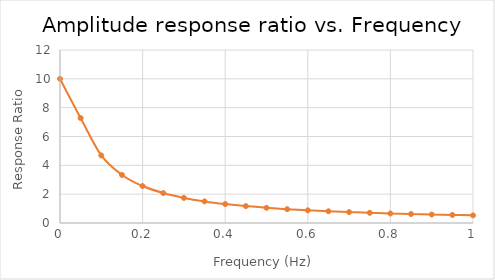
| Category | Series 1 |
|---|---|
| 0.0 | 10 |
| 0.05 | 7.277 |
| 0.1 | 4.686 |
| 0.15 | 3.334 |
| 0.2 | 2.564 |
| 0.25 | 2.076 |
| 0.3 | 1.741 |
| 0.35 | 1.499 |
| 0.4 | 1.315 |
| 0.45 | 1.171 |
| 0.5 | 1.055 |
| 0.55 | 0.96 |
| 0.6 | 0.881 |
| 0.65 | 0.813 |
| 0.7 | 0.756 |
| 0.75 | 0.706 |
| 0.8 | 0.662 |
| 0.85 | 0.623 |
| 0.9 | 0.588 |
| 0.95 | 0.558 |
| 1.0 | 0.53 |